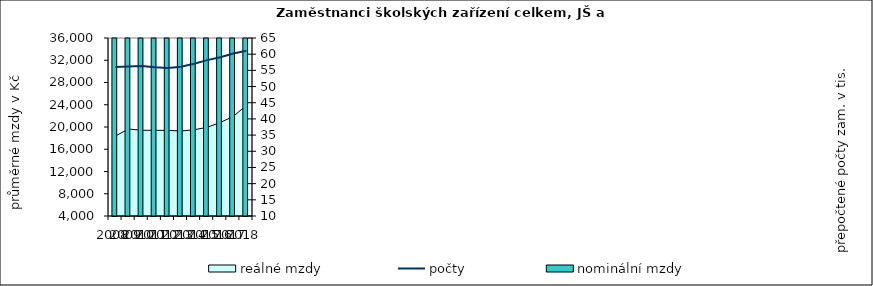
| Category | nominální mzdy  |
|---|---|
| 2008.0 | 16692.722 |
| 2009.0 | 18002.17 |
| 2010.0 | 18049.52 |
| 2011.0 | 18395.427 |
| 2012.0 | 18988.329 |
| 2013.0 | 19139.049 |
| 2014.0 | 19441.575 |
| 2015.0 | 19947.281 |
| 2016.0 | 20952.977 |
| 2017.0 | 22593.048 |
| 2018.0 | 25171.383 |